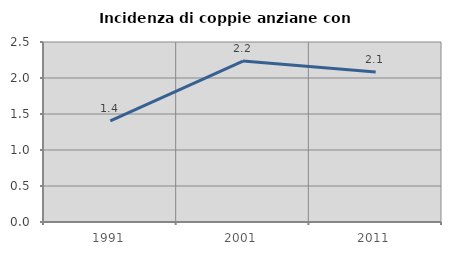
| Category | Incidenza di coppie anziane con figli |
|---|---|
| 1991.0 | 1.404 |
| 2001.0 | 2.236 |
| 2011.0 | 2.082 |